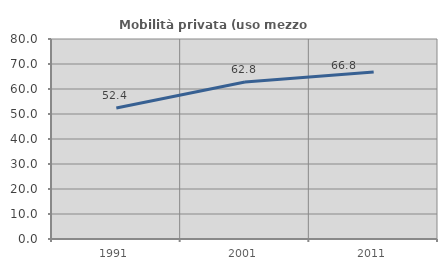
| Category | Mobilità privata (uso mezzo privato) |
|---|---|
| 1991.0 | 52.419 |
| 2001.0 | 62.822 |
| 2011.0 | 66.761 |